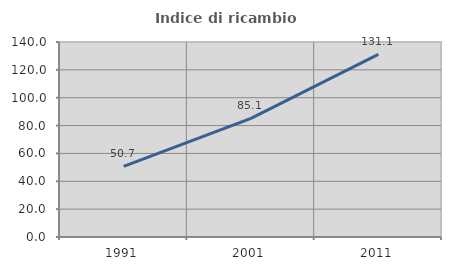
| Category | Indice di ricambio occupazionale  |
|---|---|
| 1991.0 | 50.669 |
| 2001.0 | 85.111 |
| 2011.0 | 131.115 |